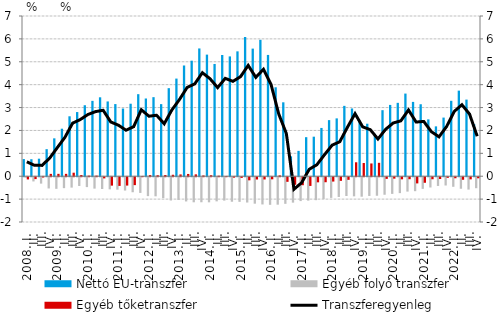
| Category | Nettó EU-transzfer | Egyéb folyó transzfer | Egyéb tőketranszfer |
|---|---|---|---|
| 2008. I. | 0.75 | -0.024 | -0.097 |
|          II. | 0.743 | -0.185 | -0.082 |
|          III. | 0.766 | -0.279 | -0.013 |
|          IV. | 1.182 | -0.491 | 0.102 |
| 2009. I. | 1.655 | -0.507 | 0.104 |
|          II. | 2.076 | -0.478 | 0.104 |
|          III. | 2.619 | -0.453 | 0.154 |
|          IV. | 2.804 | -0.382 | 0.054 |
| 2010. I. | 3.102 | -0.432 | 0.026 |
|          II. | 3.293 | -0.498 | 0.028 |
|          III. | 3.448 | -0.516 | -0.051 |
|          IV. | 3.267 | -0.53 | -0.367 |
| 2011. I. | 3.152 | -0.544 | -0.379 |
|          II. | 2.957 | -0.582 | -0.365 |
|          III. | 3.167 | -0.656 | -0.346 |
|          IV. | 3.584 | -0.686 | 0.007 |
| 2012. I. | 3.396 | -0.826 | 0.051 |
|          II. | 3.454 | -0.835 | 0.044 |
|          III. | 3.15 | -0.912 | 0.053 |
|          IV. | 3.847 | -1.016 | 0.064 |
| 2013. I. | 4.266 | -0.992 | 0.078 |
| II. | 4.838 | -1.058 | 0.099 |
|          III. | 5.048 | -1.095 | 0.081 |
| IV. | 5.582 | -1.094 | 0.034 |
| 2014. I. | 5.313 | -1.097 | 0.044 |
| II. | 4.905 | -1.055 | 0.021 |
|          III. | 5.297 | -1.022 | 0 |
| IV. | 5.235 | -1.071 | -0.019 |
| 2015. I. | 5.456 | -1.076 | -0.029 |
| II. | 6.083 | -1.106 | -0.136 |
|          III. | 5.575 | -1.156 | -0.099 |
| IV. | 5.961 | -1.19 | -0.099 |
| 2016. I. | 5.299 | -1.206 | -0.092 |
| II. | 3.886 | -1.199 | 0.037 |
|          III. | 3.229 | -1.162 | -0.201 |
| IV. | 0.872 | -1.11 | -0.33 |
| 2017. I. | 1.108 | -1.043 | -0.35 |
| II. | 1.706 | -1.022 | -0.381 |
|          III. | 1.727 | -1.002 | -0.223 |
| IV. | 2.109 | -0.949 | -0.219 |
| 2018. I. | 2.451 | -0.903 | -0.19 |
| II. | 2.527 | -0.862 | -0.158 |
|          III. | 3.074 | -0.821 | -0.114 |
| IV. | 2.96 | -0.836 | 0.609 |
| 2019. I. | 2.431 | -0.851 | 0.577 |
| II. | 2.294 | -0.819 | 0.558 |
|          III. | 1.85 | -0.809 | 0.586 |
| IV. | 2.886 | -0.766 | -0.072 |
| 2020. I. | 3.116 | -0.728 | -0.062 |
| II. | 3.206 | -0.695 | -0.092 |
|          III. | 3.611 | -0.628 | -0.088 |
| IV. | 3.247 | -0.61 | -0.27 |
| 2021. I. | 3.145 | -0.509 | -0.243 |
| II. | 2.483 | -0.449 | -0.089 |
|          III. | 2.179 | -0.382 | -0.077 |
| IV. | 2.562 | -0.362 | -0.026 |
| 2022. I. | 3.295 | -0.418 | -0.045 |
| II. | 3.739 | -0.504 | -0.112 |
|          III. | 3.348 | -0.54 | -0.093 |
| IV. | 2.275 | -0.48 | -0.047 |